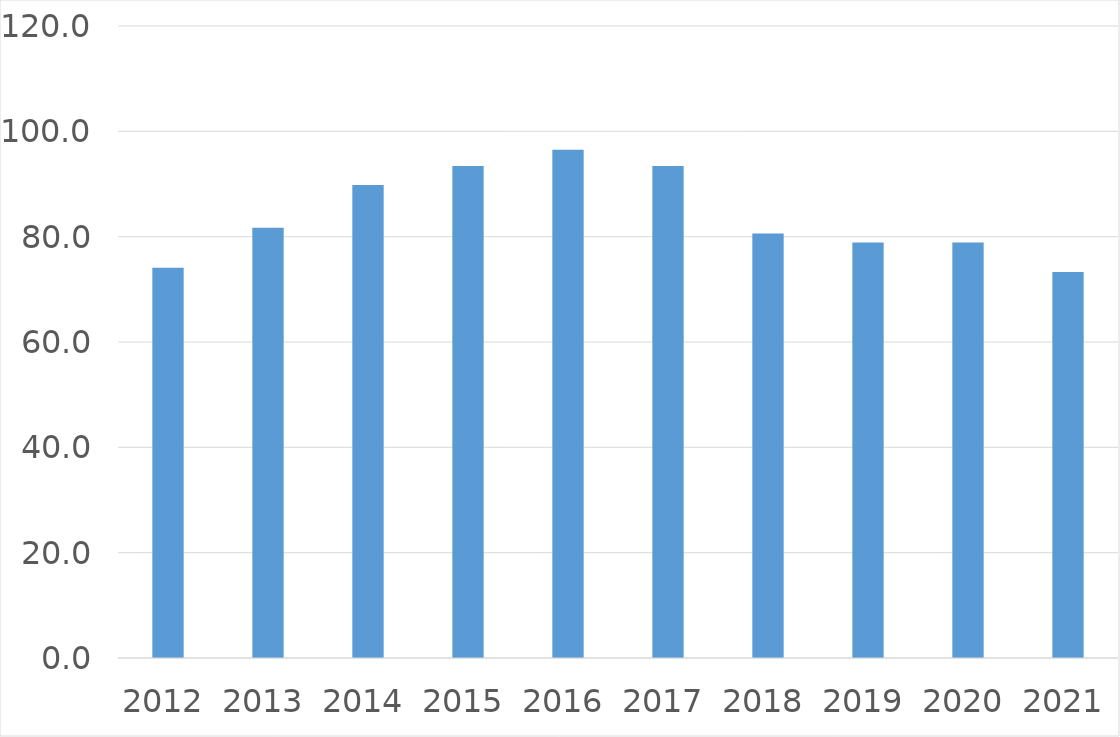
| Category | Series 0 |
|---|---|
| 2012 | 74.1 |
| 2013 | 81.7 |
| 2014 | 89.8 |
| 2015 | 93.4 |
| 2016 | 96.5 |
| 2017 | 93.4 |
| 2018 | 80.6 |
| 2019 | 78.9 |
| 2020 | 78.9 |
| 2021 | 73.3 |